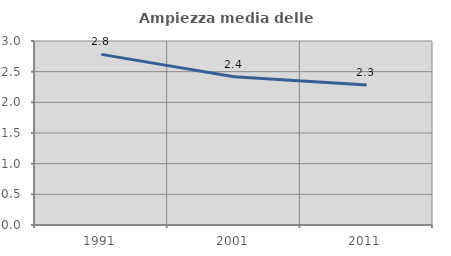
| Category | Ampiezza media delle famiglie |
|---|---|
| 1991.0 | 2.782 |
| 2001.0 | 2.418 |
| 2011.0 | 2.283 |